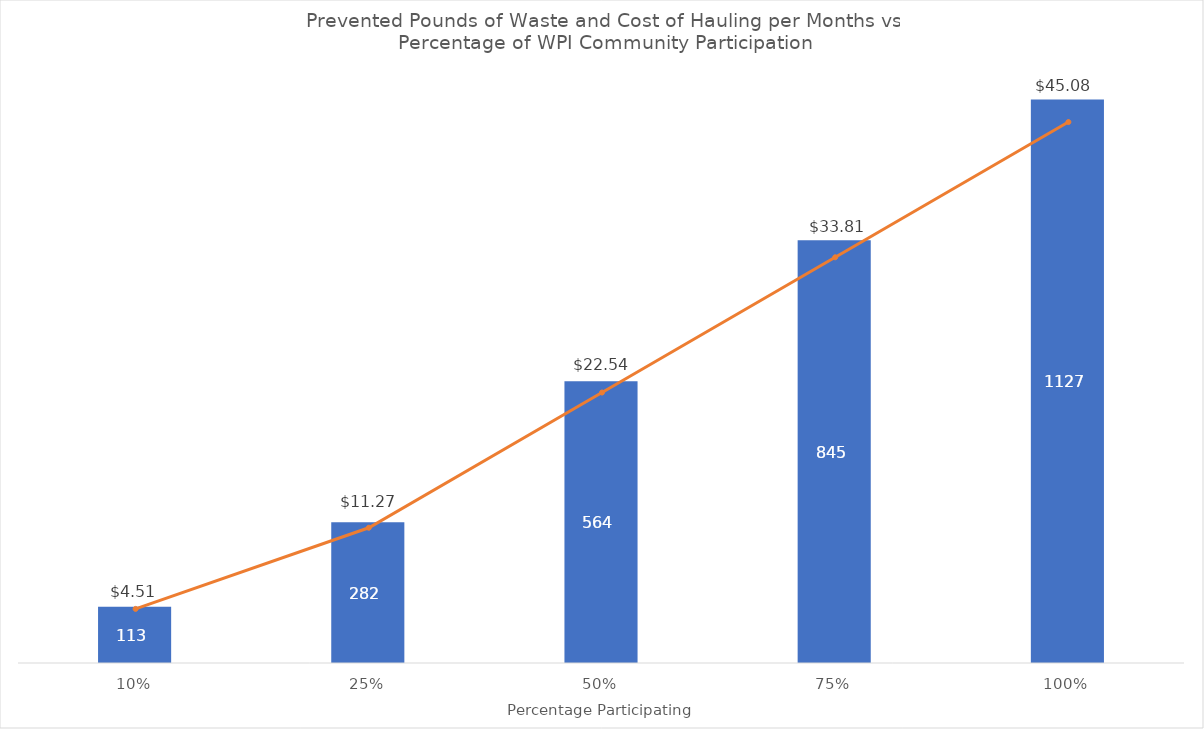
| Category | Pounds of Waste Prevented per Month |
|---|---|
| 0.1 | 112.7 |
| 0.25 | 281.75 |
| 0.5 | 563.5 |
| 0.75 | 845.25 |
| 1.0 | 1127 |